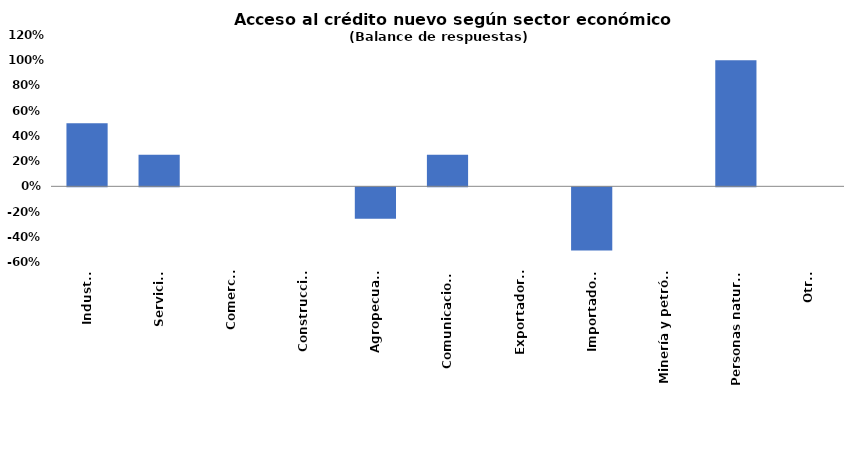
| Category | Series 0 |
|---|---|
| Industria | 0.5 |
| Servicios | 0.25 |
| Comercio | 0 |
| Construcción | 0 |
| Agropecuario | -0.25 |
| Comunicaciones | 0.25 |
| Exportadores | 0 |
| Importadores | -0.5 |
| Minería y petróleo | 0 |
| Personas naturales | 1 |
| Otro. | 0 |